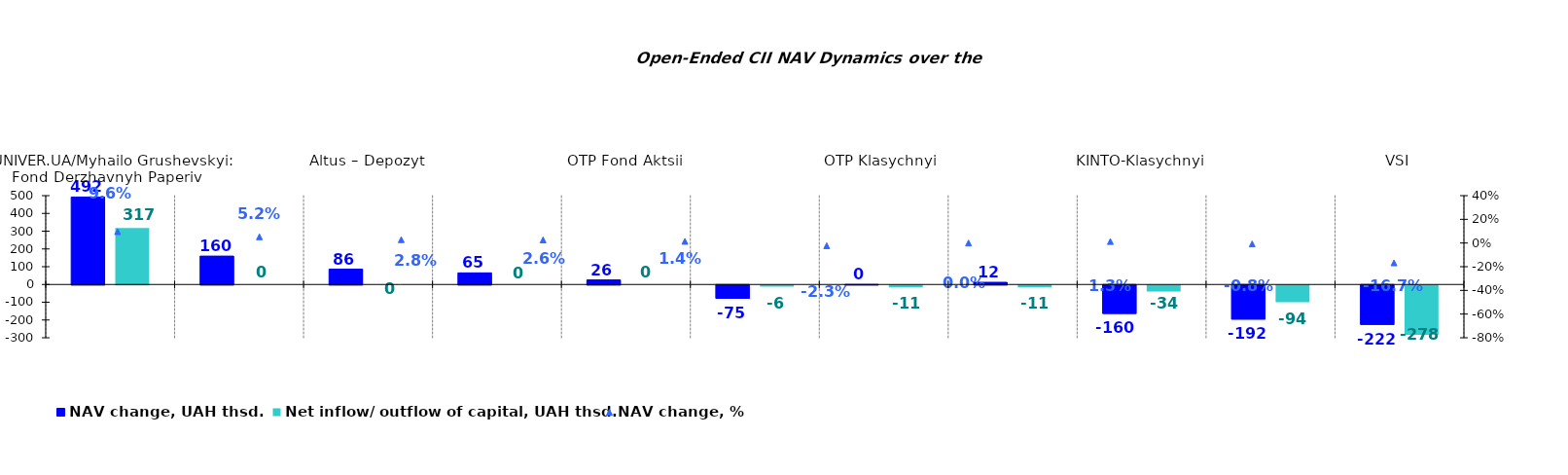
| Category | NAV change, UAH thsd. | Net inflow/ outflow of capital, UAH thsd. |
|---|---|---|
| UNIVER.UA/Myhailo Grushevskyi: Fond Derzhavnyh Paperiv    | 492.22 | 317.353 |
| UNIVER.UA/Taras Shevchenko: Fond Zaoshchadzhen | 159.628 | 0 |
| Altus – Depozyt | 86.276 | 0 |
| Altus – Zbalansovanyi | 65.108 | 0 |
| OTP Fond Aktsii | 25.713 | 0 |
| KINTO-Ekviti | -74.804 | -6.367 |
| OTP Klasychnyi  | 0.402 | -11.034 |
| UNIVER.UA/Volodymyr Velykyi: Fond Zbalansovanyi | 12.223 | -11.252 |
| KINTO-Klasychnyi | -160.201 | -33.767 |
| Argentum | -192.338 | -94.455 |
| VSI | -221.801 | -278.165 |